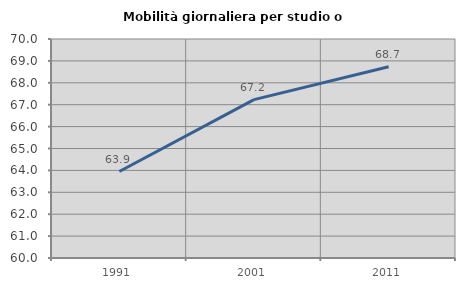
| Category | Mobilità giornaliera per studio o lavoro |
|---|---|
| 1991.0 | 63.949 |
| 2001.0 | 67.231 |
| 2011.0 | 68.73 |